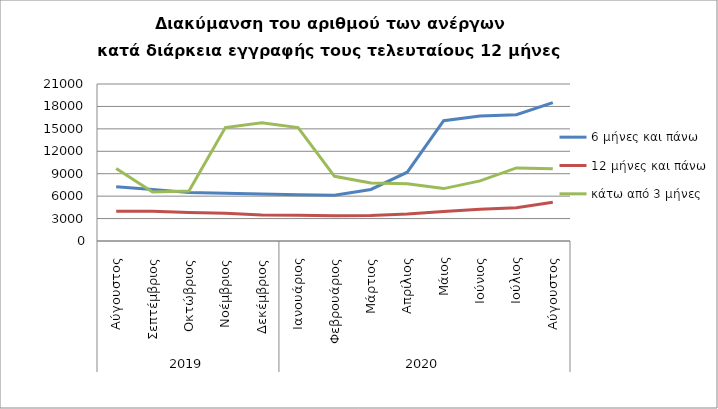
| Category | 6 μήνες και πάνω | 12 μήνες και πάνω | κάτω από 3 μήνες |
|---|---|---|---|
| 0 | 7250 | 3992 | 9701 |
| 1 | 6882 | 3982 | 6563 |
| 2 | 6500 | 3821 | 6686 |
| 3 | 6379 | 3715 | 15176 |
| 4 | 6275 | 3478 | 15812 |
| 5 | 6184 | 3454 | 15175 |
| 6 | 6133 | 3369 | 8651 |
| 7 | 6894 | 3423 | 7759 |
| 8 | 9204 | 3615 | 7657 |
| 9 | 16093 | 3960 | 7009 |
| 10 | 16710 | 4241 | 8045 |
| 11 | 16881 | 4440 | 9774 |
| 12 | 18501 | 5187 | 9666 |